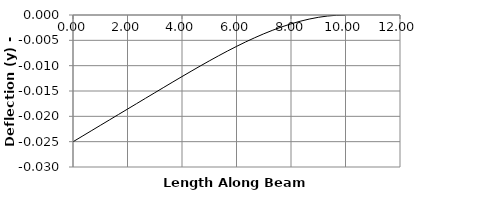
| Category | y |
|---|---|
| 0.0 | -0.025 |
| 0.3333333333333333 | -0.024 |
| 0.6666666666666666 | -0.023 |
| 1.0 | -0.022 |
| 1.3333333333333333 | -0.021 |
| 1.6666666666666665 | -0.02 |
| 2.0 | -0.019 |
| 2.0 | -0.019 |
| 2.333333333333333 | -0.017 |
| 2.6666666666666665 | -0.016 |
| 3.0 | -0.015 |
| 3.333333333333333 | -0.014 |
| 3.6666666666666665 | -0.013 |
| 4.0 | -0.012 |
| 4.333333333333333 | -0.011 |
| 4.666666666666666 | -0.01 |
| 5.0 | -0.009 |
| 5.0 | -0.009 |
| 5.333333333333333 | -0.008 |
| 5.666666666666666 | -0.007 |
| 6.0 | -0.006 |
| 6.333333333333333 | -0.005 |
| 6.666666666666666 | -0.004 |
| 7.0 | -0.004 |
| 7.333333333333333 | -0.003 |
| 7.666666666666666 | -0.002 |
| 8.0 | -0.002 |
| 8.333333333333332 | -0.001 |
| 8.666666666666666 | -0.001 |
| 9.0 | 0 |
| 9.333333333333332 | 0 |
| 9.666666666666666 | 0 |
| 10.0 | 0 |